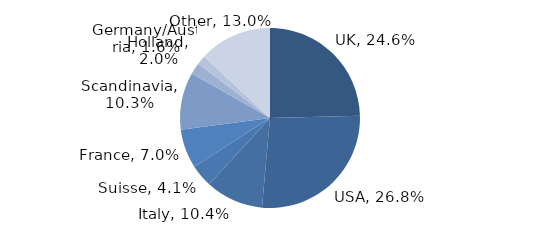
| Category | Investment Style |
|---|---|
| UK | 0.246 |
| USA | 0.268 |
| Italy | 0.104 |
| Suisse | 0.041 |
| France | 0.07 |
| Scandinavia | 0.103 |
| Holland | 0.02 |
| Germany/Austria | 0.016 |
| Other | 0.13 |